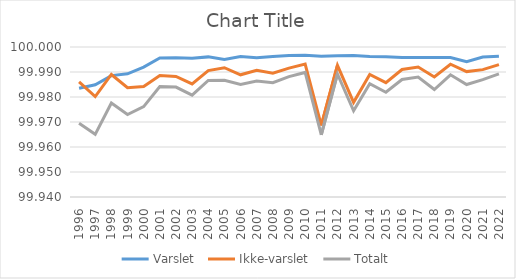
| Category | Varslet  | Ikke-varslet  | Totalt |
|---|---|---|---|
| 1996.0 | 99.983 | 99.986 | 99.969 |
| 1997.0 | 99.985 | 99.98 | 99.965 |
| 1998.0 | 99.989 | 99.989 | 99.978 |
| 1999.0 | 99.989 | 99.984 | 99.973 |
| 2000.0 | 99.992 | 99.984 | 99.976 |
| 2001.0 | 99.996 | 99.989 | 99.984 |
| 2002.0 | 99.996 | 99.988 | 99.984 |
| 2003.0 | 99.995 | 99.985 | 99.981 |
| 2004.0 | 99.996 | 99.991 | 99.987 |
| 2005.0 | 99.995 | 99.992 | 99.987 |
| 2006.0 | 99.996 | 99.989 | 99.985 |
| 2007.0 | 99.996 | 99.991 | 99.986 |
| 2008.0 | 99.996 | 99.989 | 99.986 |
| 2009.0 | 99.997 | 99.992 | 99.988 |
| 2010.0 | 99.997 | 99.993 | 99.99 |
| 2011.0 | 99.996 | 99.969 | 99.965 |
| 2012.0 | 99.997 | 99.993 | 99.989 |
| 2013.0 | 99.997 | 99.978 | 99.974 |
| 2014.0 | 99.996 | 99.989 | 99.985 |
| 2015.0 | 99.996 | 99.986 | 99.982 |
| 2016.0 | 99.996 | 99.991 | 99.987 |
| 2017.0 | 99.996 | 99.992 | 99.988 |
| 2018.0 | 99.996 | 99.988 | 99.983 |
| 2019.0 | 99.996 | 99.993 | 99.989 |
| 2020.0 | 99.994 | 99.99 | 99.985 |
| 2021.0 | 99.996 | 99.991 | 99.987 |
| 2022.0 | 99.996 | 99.993 | 99.989 |